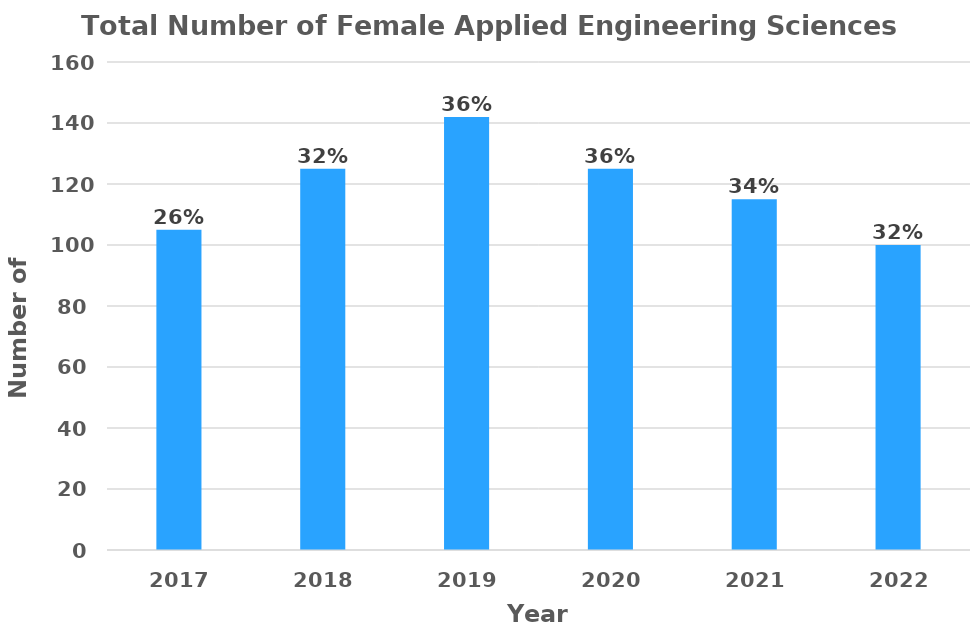
| Category | Total Number of Females |
|---|---|
| 2017.0 | 105 |
| 2018.0 | 125 |
| 2019.0 | 142 |
| 2020.0 | 125 |
| 2021.0 | 115 |
| 2022.0 | 100 |